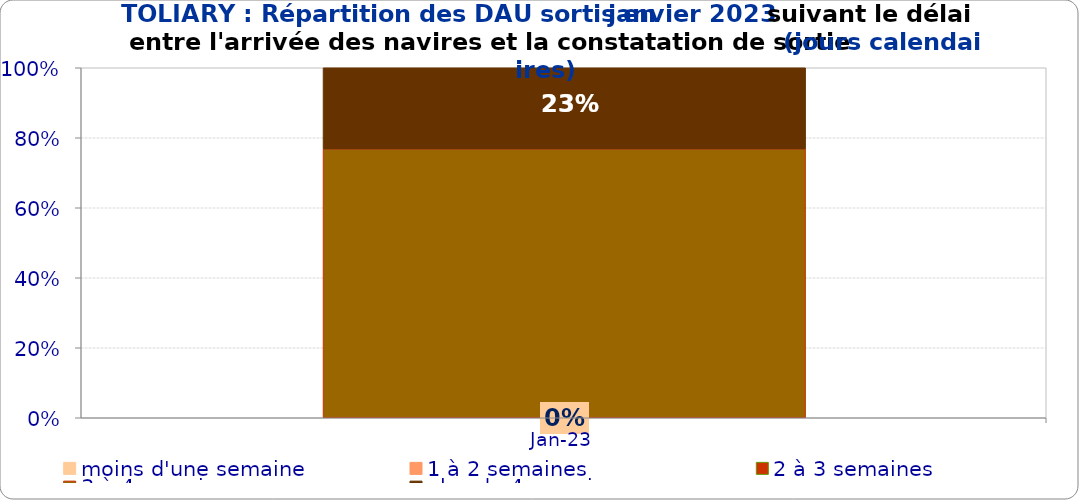
| Category | moins d'une semaine | 1 à 2 semaines | 2 à 3 semaines | 3 à 4 semaines | plus de 4 semaines |
|---|---|---|---|---|---|
| 2023-01-01 | 0 | 0 | 0 | 0.768 | 0.232 |